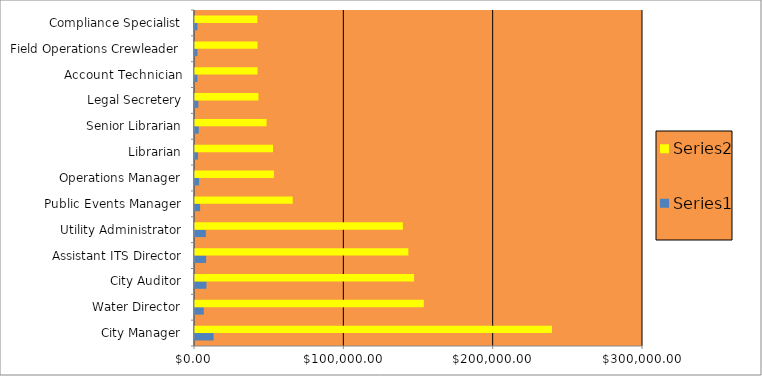
| Category | Series 0 | Series 1 |
|---|---|---|
| City Manager | 12462.725 | 239057.725 |
| Water Director | 5893.88 | 153240.88 |
| City Auditor | 7647.64 | 146695.64 |
| Assistant ITS Director | 7448.595 | 142877.595 |
| Utility Administrator | 7256.37 | 139190.37 |
| Public Events Manager | 3410.44 | 65418.44 |
| Operations Manager | 2755.885 | 52862.885 |
| Librarian | 2009.28 | 52241.28 |
| Senior Librarian | 2499.64 | 47947.64 |
| Legal Secretery | 2215.95 | 42505.95 |
| Account Technician | 1611.6 | 41901.6 |
| Field Operations Crewleader | 1610.76 | 41879.76 |
| Compliance Specialist | 1606.6 | 41771.6 |